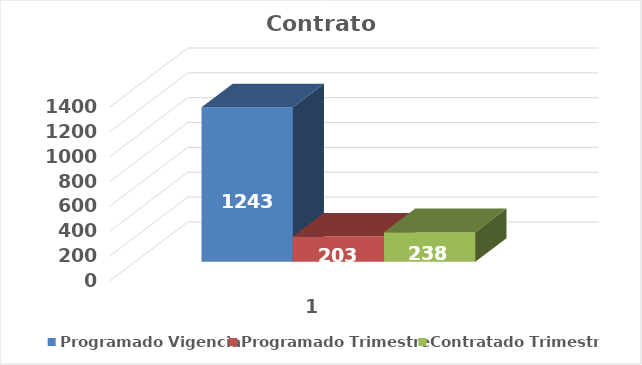
| Category | Programado Vigencia | Programado Trimestre | Contratado Trimestre |
|---|---|---|---|
| 0 | 1243 | 203 | 238 |